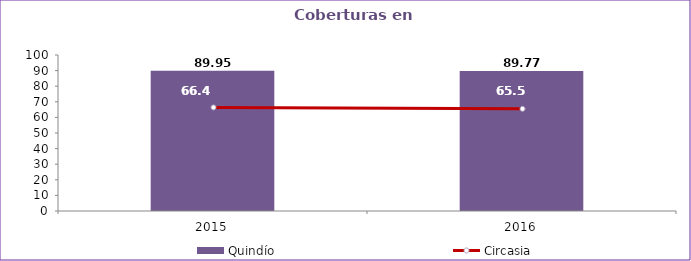
| Category | Quindío |
|---|---|
| 2015.0 | 89.95 |
| 2016.0 | 89.77 |